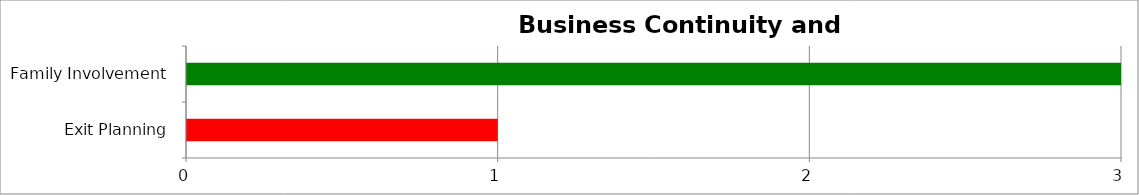
| Category | Series 0 | Series 1 | Series 2 |
|---|---|---|---|
| Exit Planning | 0 | 0 | 1 |
| Family Involvement | 3 | 0 | 0 |